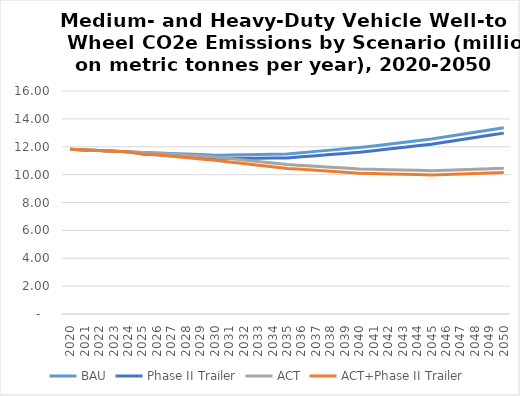
| Category | BAU | Phase II Trailer | ACT | ACT+Phase II Trailer |
|---|---|---|---|---|
| 2020.0 | 11.819 | 11.819 | 11.819 | 11.819 |
| 2021.0 | 11.774 | 11.774 | 11.774 | 11.774 |
| 2022.0 | 11.73 | 11.73 | 11.73 | 11.73 |
| 2023.0 | 11.685 | 11.685 | 11.685 | 11.685 |
| 2024.0 | 11.64 | 11.64 | 11.64 | 11.64 |
| 2025.0 | 11.596 | 11.483 | 11.596 | 11.483 |
| 2026.0 | 11.556 | 11.419 | 11.556 | 11.419 |
| 2027.0 | 11.517 | 11.355 | 11.481 | 11.32 |
| 2028.0 | 11.477 | 11.29 | 11.407 | 11.221 |
| 2029.0 | 11.438 | 11.226 | 11.332 | 11.122 |
| 2030.0 | 11.398 | 11.162 | 11.257 | 11.023 |
| 2031.0 | 11.416 | 11.168 | 11.151 | 10.908 |
| 2032.0 | 11.434 | 11.174 | 11.044 | 10.793 |
| 2033.0 | 11.452 | 11.18 | 10.938 | 10.678 |
| 2034.0 | 11.47 | 11.186 | 10.832 | 10.562 |
| 2035.0 | 11.488 | 11.192 | 10.725 | 10.447 |
| 2036.0 | 11.578 | 11.274 | 10.661 | 10.379 |
| 2037.0 | 11.668 | 11.356 | 10.597 | 10.311 |
| 2038.0 | 11.758 | 11.439 | 10.532 | 10.242 |
| 2039.0 | 11.848 | 11.521 | 10.468 | 10.174 |
| 2040.0 | 11.938 | 11.603 | 10.404 | 10.106 |
| 2041.0 | 12.06 | 11.719 | 10.38 | 10.08 |
| 2042.0 | 12.183 | 11.836 | 10.356 | 10.054 |
| 2043.0 | 12.305 | 11.952 | 10.332 | 10.028 |
| 2044.0 | 12.427 | 12.069 | 10.308 | 10.002 |
| 2045.0 | 12.55 | 12.186 | 10.285 | 9.976 |
| 2046.0 | 12.714 | 12.344 | 10.321 | 10.01 |
| 2047.0 | 12.878 | 12.502 | 10.357 | 10.043 |
| 2048.0 | 13.042 | 12.661 | 10.393 | 10.077 |
| 2049.0 | 13.206 | 12.819 | 10.43 | 10.111 |
| 2050.0 | 13.369 | 12.977 | 10.466 | 10.144 |